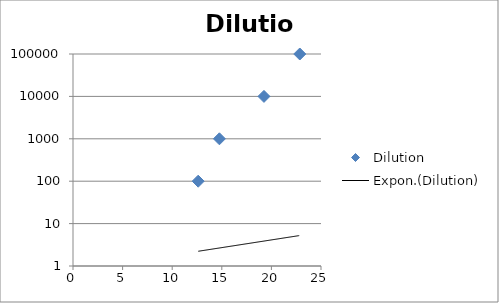
| Category | Dilution |
|---|---|
| 12.62 | 100 |
| 14.76 | 1000 |
| 19.25 | 10000 |
| 22.86 | 100000 |